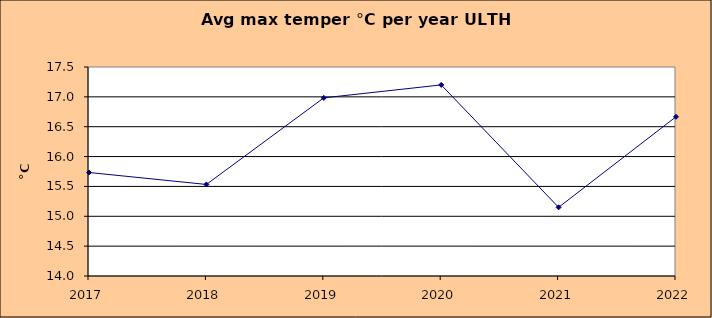
| Category | Series 0 |
|---|---|
| 2017.0 | 15.733 |
| 2018.0 | 15.533 |
| 2019.0 | 16.983 |
| 2020.0 | 17.2 |
| 2021.0 | 15.15 |
| 2022.0 | 16.667 |